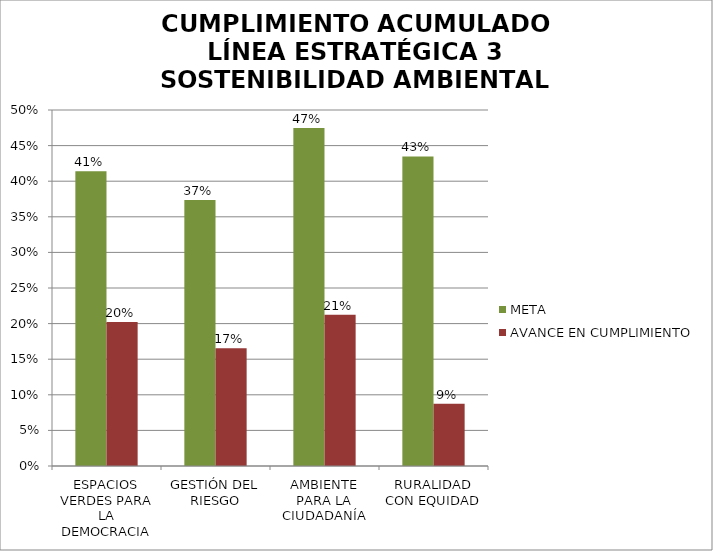
| Category | META | AVANCE EN CUMPLIMIENTO |
|---|---|---|
| ESPACIOS VERDES PARA LA DEMOCRACIA | 0.414 | 0.202 |
| GESTIÓN DEL RIESGO | 0.373 | 0.165 |
| AMBIENTE PARA LA CIUDADANÍA | 0.475 | 0.213 |
| RURALIDAD CON EQUIDAD | 0.435 | 0.087 |